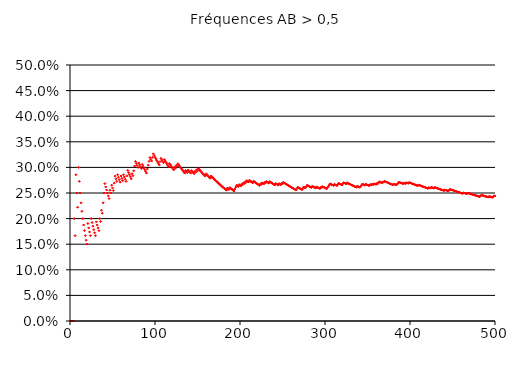
| Category | Fréquences AB > 0,5 |
|---|---|
| 0 | 0 |
| 1 | 0 |
| 2 | 0 |
| 3 | 0 |
| 4 | 0.2 |
| 5 | 0.167 |
| 6 | 0.286 |
| 7 | 0.25 |
| 8 | 0.222 |
| 9 | 0.3 |
| 10 | 0.273 |
| 11 | 0.25 |
| 12 | 0.231 |
| 13 | 0.214 |
| 14 | 0.2 |
| 15 | 0.188 |
| 16 | 0.176 |
| 17 | 0.167 |
| 18 | 0.158 |
| 19 | 0.15 |
| 20 | 0.19 |
| 21 | 0.182 |
| 22 | 0.174 |
| 23 | 0.167 |
| 24 | 0.2 |
| 25 | 0.192 |
| 26 | 0.185 |
| 27 | 0.179 |
| 28 | 0.172 |
| 29 | 0.167 |
| 30 | 0.194 |
| 31 | 0.188 |
| 32 | 0.182 |
| 33 | 0.176 |
| 34 | 0.2 |
| 35 | 0.194 |
| 36 | 0.216 |
| 37 | 0.211 |
| 38 | 0.231 |
| 39 | 0.25 |
| 40 | 0.268 |
| 41 | 0.262 |
| 42 | 0.256 |
| 43 | 0.25 |
| 44 | 0.244 |
| 45 | 0.239 |
| 46 | 0.255 |
| 47 | 0.25 |
| 48 | 0.265 |
| 49 | 0.26 |
| 50 | 0.255 |
| 51 | 0.269 |
| 52 | 0.283 |
| 53 | 0.278 |
| 54 | 0.273 |
| 55 | 0.286 |
| 56 | 0.281 |
| 57 | 0.276 |
| 58 | 0.271 |
| 59 | 0.283 |
| 60 | 0.279 |
| 61 | 0.274 |
| 62 | 0.286 |
| 63 | 0.281 |
| 64 | 0.277 |
| 65 | 0.273 |
| 66 | 0.284 |
| 67 | 0.294 |
| 68 | 0.29 |
| 69 | 0.286 |
| 70 | 0.282 |
| 71 | 0.278 |
| 72 | 0.288 |
| 73 | 0.284 |
| 74 | 0.293 |
| 75 | 0.303 |
| 76 | 0.312 |
| 77 | 0.308 |
| 78 | 0.304 |
| 79 | 0.3 |
| 80 | 0.309 |
| 81 | 0.305 |
| 82 | 0.301 |
| 83 | 0.298 |
| 84 | 0.306 |
| 85 | 0.302 |
| 86 | 0.299 |
| 87 | 0.295 |
| 88 | 0.292 |
| 89 | 0.289 |
| 90 | 0.297 |
| 91 | 0.304 |
| 92 | 0.312 |
| 93 | 0.319 |
| 94 | 0.316 |
| 95 | 0.312 |
| 96 | 0.32 |
| 97 | 0.327 |
| 98 | 0.323 |
| 99 | 0.32 |
| 100 | 0.317 |
| 101 | 0.314 |
| 102 | 0.311 |
| 103 | 0.308 |
| 104 | 0.305 |
| 105 | 0.311 |
| 106 | 0.318 |
| 107 | 0.315 |
| 108 | 0.312 |
| 109 | 0.309 |
| 110 | 0.315 |
| 111 | 0.312 |
| 112 | 0.31 |
| 113 | 0.307 |
| 114 | 0.304 |
| 115 | 0.302 |
| 116 | 0.308 |
| 117 | 0.305 |
| 118 | 0.303 |
| 119 | 0.3 |
| 120 | 0.298 |
| 121 | 0.295 |
| 122 | 0.301 |
| 123 | 0.298 |
| 124 | 0.304 |
| 125 | 0.302 |
| 126 | 0.307 |
| 127 | 0.305 |
| 128 | 0.302 |
| 129 | 0.3 |
| 130 | 0.298 |
| 131 | 0.295 |
| 132 | 0.293 |
| 133 | 0.291 |
| 134 | 0.289 |
| 135 | 0.294 |
| 136 | 0.292 |
| 137 | 0.29 |
| 138 | 0.295 |
| 139 | 0.293 |
| 140 | 0.291 |
| 141 | 0.289 |
| 142 | 0.294 |
| 143 | 0.292 |
| 144 | 0.29 |
| 145 | 0.288 |
| 146 | 0.293 |
| 147 | 0.291 |
| 148 | 0.295 |
| 149 | 0.293 |
| 150 | 0.298 |
| 151 | 0.296 |
| 152 | 0.294 |
| 153 | 0.292 |
| 154 | 0.29 |
| 155 | 0.288 |
| 156 | 0.287 |
| 157 | 0.285 |
| 158 | 0.283 |
| 159 | 0.288 |
| 160 | 0.286 |
| 161 | 0.284 |
| 162 | 0.282 |
| 163 | 0.28 |
| 164 | 0.279 |
| 165 | 0.283 |
| 166 | 0.281 |
| 167 | 0.28 |
| 168 | 0.278 |
| 169 | 0.276 |
| 170 | 0.275 |
| 171 | 0.273 |
| 172 | 0.272 |
| 173 | 0.27 |
| 174 | 0.269 |
| 175 | 0.267 |
| 176 | 0.266 |
| 177 | 0.264 |
| 178 | 0.263 |
| 179 | 0.261 |
| 180 | 0.26 |
| 181 | 0.258 |
| 182 | 0.257 |
| 183 | 0.255 |
| 184 | 0.259 |
| 185 | 0.258 |
| 186 | 0.257 |
| 187 | 0.261 |
| 188 | 0.259 |
| 189 | 0.258 |
| 190 | 0.257 |
| 191 | 0.255 |
| 192 | 0.254 |
| 193 | 0.258 |
| 194 | 0.262 |
| 195 | 0.265 |
| 196 | 0.264 |
| 197 | 0.263 |
| 198 | 0.266 |
| 199 | 0.265 |
| 200 | 0.264 |
| 201 | 0.267 |
| 202 | 0.266 |
| 203 | 0.27 |
| 204 | 0.268 |
| 205 | 0.272 |
| 206 | 0.271 |
| 207 | 0.274 |
| 208 | 0.273 |
| 209 | 0.271 |
| 210 | 0.275 |
| 211 | 0.274 |
| 212 | 0.272 |
| 213 | 0.271 |
| 214 | 0.27 |
| 215 | 0.273 |
| 216 | 0.272 |
| 217 | 0.271 |
| 218 | 0.269 |
| 219 | 0.268 |
| 220 | 0.267 |
| 221 | 0.266 |
| 222 | 0.265 |
| 223 | 0.268 |
| 224 | 0.267 |
| 225 | 0.27 |
| 226 | 0.269 |
| 227 | 0.268 |
| 228 | 0.271 |
| 229 | 0.27 |
| 230 | 0.273 |
| 231 | 0.272 |
| 232 | 0.27 |
| 233 | 0.269 |
| 234 | 0.272 |
| 235 | 0.271 |
| 236 | 0.27 |
| 237 | 0.269 |
| 238 | 0.268 |
| 239 | 0.267 |
| 240 | 0.266 |
| 241 | 0.269 |
| 242 | 0.267 |
| 243 | 0.266 |
| 244 | 0.265 |
| 245 | 0.268 |
| 246 | 0.267 |
| 247 | 0.266 |
| 248 | 0.269 |
| 249 | 0.268 |
| 250 | 0.271 |
| 251 | 0.27 |
| 252 | 0.269 |
| 253 | 0.268 |
| 254 | 0.267 |
| 255 | 0.266 |
| 256 | 0.265 |
| 257 | 0.264 |
| 258 | 0.263 |
| 259 | 0.262 |
| 260 | 0.261 |
| 261 | 0.26 |
| 262 | 0.259 |
| 263 | 0.258 |
| 264 | 0.257 |
| 265 | 0.256 |
| 266 | 0.258 |
| 267 | 0.261 |
| 268 | 0.26 |
| 269 | 0.259 |
| 270 | 0.258 |
| 271 | 0.257 |
| 272 | 0.256 |
| 273 | 0.259 |
| 274 | 0.262 |
| 275 | 0.261 |
| 276 | 0.26 |
| 277 | 0.263 |
| 278 | 0.265 |
| 279 | 0.264 |
| 280 | 0.263 |
| 281 | 0.262 |
| 282 | 0.261 |
| 283 | 0.261 |
| 284 | 0.263 |
| 285 | 0.262 |
| 286 | 0.261 |
| 287 | 0.26 |
| 288 | 0.26 |
| 289 | 0.262 |
| 290 | 0.261 |
| 291 | 0.26 |
| 292 | 0.259 |
| 293 | 0.259 |
| 294 | 0.261 |
| 295 | 0.26 |
| 296 | 0.263 |
| 297 | 0.262 |
| 298 | 0.261 |
| 299 | 0.26 |
| 300 | 0.259 |
| 301 | 0.258 |
| 302 | 0.261 |
| 303 | 0.263 |
| 304 | 0.266 |
| 305 | 0.268 |
| 306 | 0.267 |
| 307 | 0.266 |
| 308 | 0.265 |
| 309 | 0.265 |
| 310 | 0.267 |
| 311 | 0.266 |
| 312 | 0.265 |
| 313 | 0.264 |
| 314 | 0.267 |
| 315 | 0.269 |
| 316 | 0.268 |
| 317 | 0.267 |
| 318 | 0.266 |
| 319 | 0.266 |
| 320 | 0.268 |
| 321 | 0.27 |
| 322 | 0.269 |
| 323 | 0.269 |
| 324 | 0.268 |
| 325 | 0.27 |
| 326 | 0.269 |
| 327 | 0.268 |
| 328 | 0.267 |
| 329 | 0.267 |
| 330 | 0.266 |
| 331 | 0.265 |
| 332 | 0.264 |
| 333 | 0.263 |
| 334 | 0.263 |
| 335 | 0.262 |
| 336 | 0.261 |
| 337 | 0.263 |
| 338 | 0.263 |
| 339 | 0.262 |
| 340 | 0.261 |
| 341 | 0.263 |
| 342 | 0.265 |
| 343 | 0.267 |
| 344 | 0.267 |
| 345 | 0.266 |
| 346 | 0.265 |
| 347 | 0.267 |
| 348 | 0.266 |
| 349 | 0.266 |
| 350 | 0.265 |
| 351 | 0.264 |
| 352 | 0.266 |
| 353 | 0.266 |
| 354 | 0.268 |
| 355 | 0.267 |
| 356 | 0.266 |
| 357 | 0.268 |
| 358 | 0.267 |
| 359 | 0.267 |
| 360 | 0.269 |
| 361 | 0.268 |
| 362 | 0.27 |
| 363 | 0.272 |
| 364 | 0.271 |
| 365 | 0.27 |
| 366 | 0.27 |
| 367 | 0.272 |
| 368 | 0.271 |
| 369 | 0.273 |
| 370 | 0.272 |
| 371 | 0.272 |
| 372 | 0.271 |
| 373 | 0.27 |
| 374 | 0.269 |
| 375 | 0.269 |
| 376 | 0.268 |
| 377 | 0.267 |
| 378 | 0.266 |
| 379 | 0.266 |
| 380 | 0.268 |
| 381 | 0.267 |
| 382 | 0.266 |
| 383 | 0.266 |
| 384 | 0.268 |
| 385 | 0.269 |
| 386 | 0.271 |
| 387 | 0.271 |
| 388 | 0.27 |
| 389 | 0.269 |
| 390 | 0.269 |
| 391 | 0.268 |
| 392 | 0.27 |
| 393 | 0.269 |
| 394 | 0.268 |
| 395 | 0.27 |
| 396 | 0.27 |
| 397 | 0.269 |
| 398 | 0.271 |
| 399 | 0.27 |
| 400 | 0.269 |
| 401 | 0.269 |
| 402 | 0.268 |
| 403 | 0.267 |
| 404 | 0.267 |
| 405 | 0.266 |
| 406 | 0.265 |
| 407 | 0.265 |
| 408 | 0.264 |
| 409 | 0.266 |
| 410 | 0.265 |
| 411 | 0.265 |
| 412 | 0.264 |
| 413 | 0.263 |
| 414 | 0.263 |
| 415 | 0.262 |
| 416 | 0.261 |
| 417 | 0.261 |
| 418 | 0.26 |
| 419 | 0.26 |
| 420 | 0.259 |
| 421 | 0.261 |
| 422 | 0.26 |
| 423 | 0.259 |
| 424 | 0.261 |
| 425 | 0.261 |
| 426 | 0.26 |
| 427 | 0.259 |
| 428 | 0.261 |
| 429 | 0.26 |
| 430 | 0.26 |
| 431 | 0.259 |
| 432 | 0.259 |
| 433 | 0.258 |
| 434 | 0.257 |
| 435 | 0.257 |
| 436 | 0.256 |
| 437 | 0.256 |
| 438 | 0.255 |
| 439 | 0.255 |
| 440 | 0.256 |
| 441 | 0.256 |
| 442 | 0.255 |
| 443 | 0.255 |
| 444 | 0.254 |
| 445 | 0.256 |
| 446 | 0.257 |
| 447 | 0.257 |
| 448 | 0.256 |
| 449 | 0.256 |
| 450 | 0.255 |
| 451 | 0.254 |
| 452 | 0.254 |
| 453 | 0.253 |
| 454 | 0.253 |
| 455 | 0.252 |
| 456 | 0.252 |
| 457 | 0.251 |
| 458 | 0.251 |
| 459 | 0.25 |
| 460 | 0.249 |
| 461 | 0.249 |
| 462 | 0.251 |
| 463 | 0.25 |
| 464 | 0.249 |
| 465 | 0.249 |
| 466 | 0.248 |
| 467 | 0.25 |
| 468 | 0.249 |
| 469 | 0.249 |
| 470 | 0.248 |
| 471 | 0.248 |
| 472 | 0.247 |
| 473 | 0.247 |
| 474 | 0.246 |
| 475 | 0.246 |
| 476 | 0.245 |
| 477 | 0.245 |
| 478 | 0.244 |
| 479 | 0.244 |
| 480 | 0.243 |
| 481 | 0.243 |
| 482 | 0.244 |
| 483 | 0.246 |
| 484 | 0.245 |
| 485 | 0.245 |
| 486 | 0.244 |
| 487 | 0.244 |
| 488 | 0.243 |
| 489 | 0.243 |
| 490 | 0.242 |
| 491 | 0.242 |
| 492 | 0.243 |
| 493 | 0.243 |
| 494 | 0.242 |
| 495 | 0.242 |
| 496 | 0.241 |
| 497 | 0.243 |
| 498 | 0.244 |
| 499 | 0.244 |